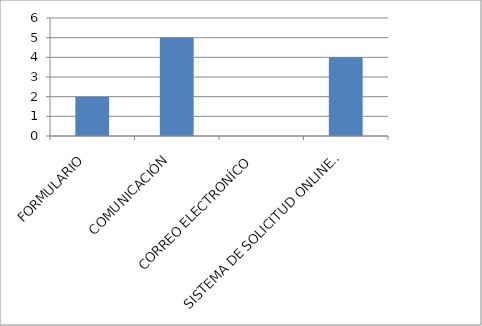
| Category | Series 0 |
|---|---|
| FORMULARIO  | 2 |
| COMUNICACIÓN  | 5 |
| CORREO ELECTRONÍCO  | 0 |
| SISTEMA DE SOLICITUD ONLINE SAIP | 4 |